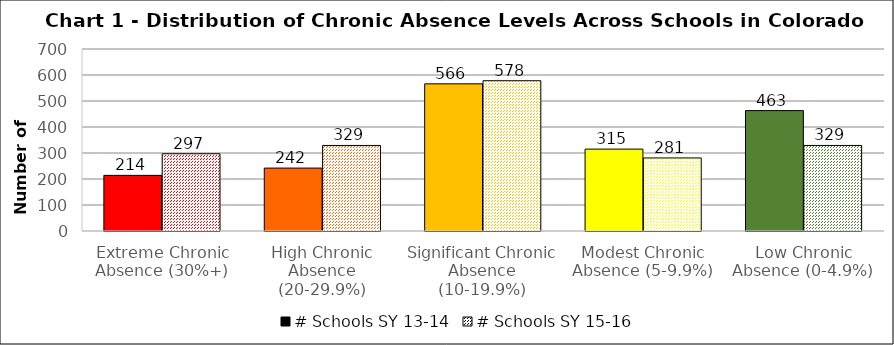
| Category | # Schools SY 13-14 | # Schools SY 15-16 |
|---|---|---|
| Extreme Chronic Absence (30%+) | 214 | 297 |
| High Chronic Absence (20-29.9%) | 242 | 329 |
| Significant Chronic Absence (10-19.9%) | 566 | 578 |
| Modest Chronic Absence (5-9.9%) | 315 | 281 |
| Low Chronic Absence (0-4.9%) | 463 | 329 |